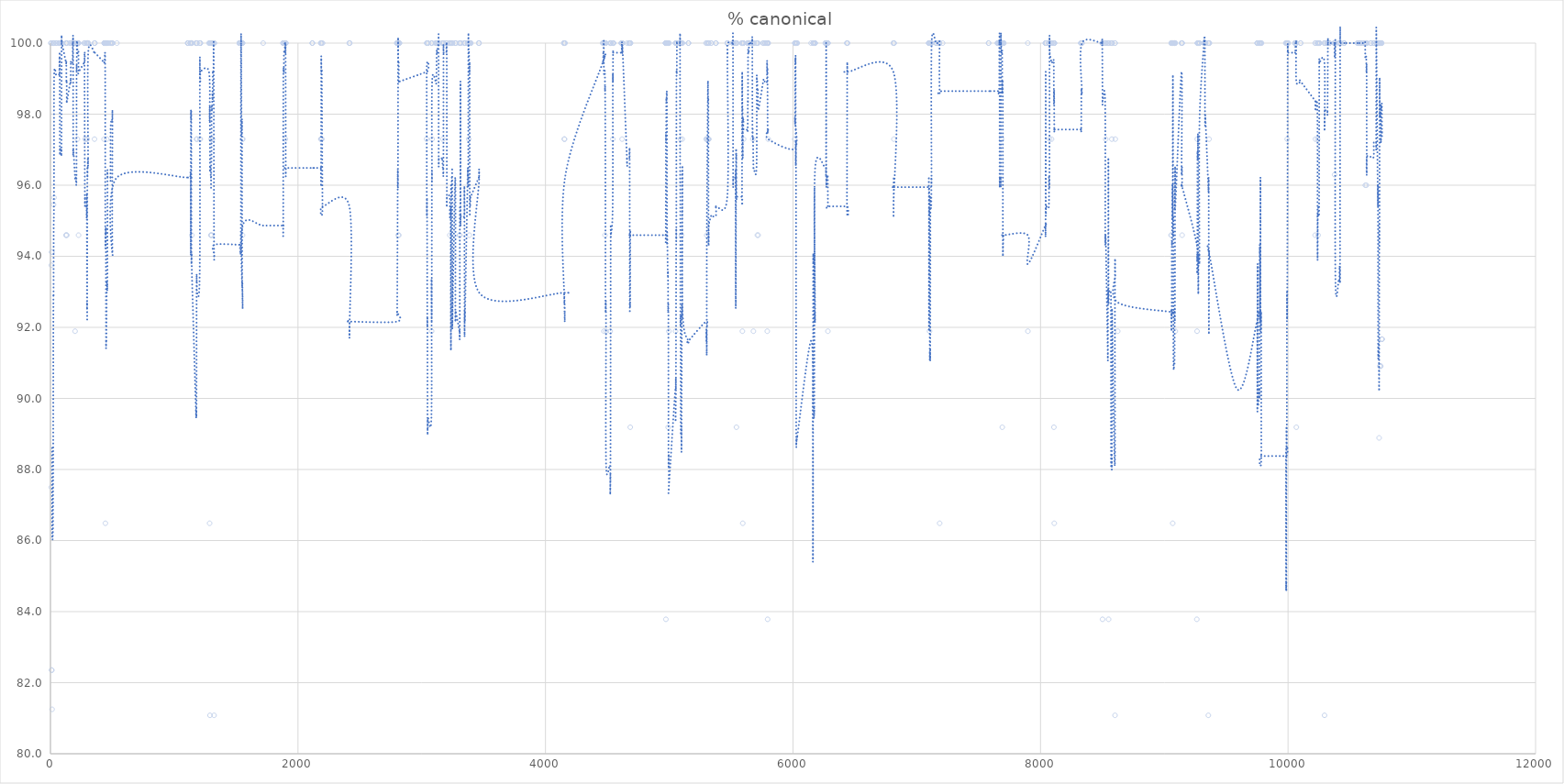
| Category | % canonical |
|---|---|
| 4.0 | 100 |
| 5.0 | 100 |
| 6.0 | 87.5 |
| 7.0 | 93.75 |
| 8.0 | 70.588 |
| 9.0 | 82.353 |
| 10.0 | 94.118 |
| 11.0 | 82.353 |
| 12.0 | 94.118 |
| 13.0 | 81.25 |
| 14.0 | 76.471 |
| 20.0 | 100 |
| 21.0 | 100 |
| 22.0 | 100 |
| 23.0 | 100 |
| 24.0 | 100 |
| 25.0 | 95.455 |
| 26.0 | 100 |
| 28.0 | 100 |
| 29.0 | 95.652 |
| 30.0 | 100 |
| 45.0 | 100 |
| 46.0 | 100 |
| 47.0 | 100 |
| 71.0 | 100 |
| 72.0 | 100 |
| 73.0 | 100 |
| 74.0 | 100 |
| 75.0 | 100 |
| 76.0 | 70.37 |
| 78.0 | 100 |
| 79.0 | 100 |
| 81.0 | 100 |
| 82.0 | 100 |
| 83.0 | 100 |
| 86.0 | 100 |
| 87.0 | 100 |
| 88.0 | 100 |
| 89.0 | 100 |
| 90.0 | 100 |
| 91.0 | 100 |
| 92.0 | 100 |
| 93.0 | 100 |
| 125.0 | 94.595 |
| 126.0 | 100 |
| 127.0 | 100 |
| 128.0 | 100 |
| 129.0 | 94.595 |
| 130.0 | 100 |
| 131.0 | 100 |
| 132.0 | 94.595 |
| 133.0 | 100 |
| 134.0 | 100 |
| 161.0 | 100 |
| 162.0 | 100 |
| 163.0 | 100 |
| 164.0 | 100 |
| 165.0 | 100 |
| 166.0 | 100 |
| 179.0 | 100 |
| 180.0 | 100 |
| 181.0 | 100 |
| 182.0 | 100 |
| 183.0 | 100 |
| 184.0 | 70.27 |
| 185.0 | 100 |
| 199.0 | 91.892 |
| 200.0 | 100 |
| 202.0 | 100 |
| 203.0 | 100 |
| 204.0 | 100 |
| 205.0 | 100 |
| 206.0 | 100 |
| 210.0 | 100 |
| 211.0 | 100 |
| 212.0 | 100 |
| 213.0 | 100 |
| 214.0 | 100 |
| 215.0 | 100 |
| 216.0 | 100 |
| 217.0 | 100 |
| 218.0 | 97.297 |
| 219.0 | 100 |
| 220.0 | 100 |
| 221.0 | 100 |
| 223.0 | 100 |
| 224.0 | 100 |
| 225.0 | 100 |
| 226.0 | 100 |
| 227.0 | 94.595 |
| 228.0 | 100 |
| 274.0 | 100 |
| 275.0 | 100 |
| 278.0 | 62.162 |
| 279.0 | 100 |
| 280.0 | 97.297 |
| 291.0 | 100 |
| 292.0 | 97.297 |
| 293.0 | 100 |
| 294.0 | 100 |
| 295.0 | 70.27 |
| 296.0 | 100 |
| 297.0 | 97.297 |
| 298.0 | 100 |
| 299.0 | 100 |
| 300.0 | 100 |
| 301.0 | 100 |
| 302.0 | 100 |
| 303.0 | 100 |
| 304.0 | 100 |
| 305.0 | 100 |
| 355.0 | 100 |
| 356.0 | 97.297 |
| 358.0 | 100 |
| 359.0 | 100 |
| 433.0 | 97.297 |
| 434.0 | 100 |
| 435.0 | 100 |
| 436.0 | 100 |
| 437.0 | 100 |
| 438.0 | 100 |
| 442.0 | 100 |
| 443.0 | 59.459 |
| 444.0 | 86.486 |
| 445.0 | 100 |
| 446.0 | 100 |
| 447.0 | 100 |
| 448.0 | 100 |
| 449.0 | 70.27 |
| 450.0 | 100 |
| 451.0 | 100 |
| 452.0 | 100 |
| 453.0 | 64.865 |
| 455.0 | 97.297 |
| 456.0 | 100 |
| 457.0 | 100 |
| 458.0 | 100 |
| 460.0 | 100 |
| 461.0 | 100 |
| 462.0 | 100 |
| 484.0 | 100 |
| 485.0 | 100 |
| 486.0 | 78.378 |
| 494.0 | 100 |
| 495.0 | 100 |
| 496.0 | 100 |
| 497.0 | 100 |
| 498.0 | 100 |
| 499.0 | 100 |
| 500.0 | 100 |
| 501.0 | 100 |
| 502.0 | 62.162 |
| 537.0 | 100 |
| 1109.0 | 100 |
| 1110.0 | 100 |
| 1111.0 | 100 |
| 1112.0 | 100 |
| 1129.0 | 100 |
| 1130.0 | 100 |
| 1133.0 | 100 |
| 1134.0 | 78.378 |
| 1135.0 | 100 |
| 1136.0 | 100 |
| 1137.0 | 100 |
| 1138.0 | 100 |
| 1139.0 | 62.162 |
| 1140.0 | 100 |
| 1141.0 | 100 |
| 1142.0 | 100 |
| 1143.0 | 94.595 |
| 1175.0 | 40.541 |
| 1176.0 | 100 |
| 1178.0 | 100 |
| 1179.0 | 100 |
| 1180.0 | 100 |
| 1181.0 | 97.297 |
| 1182.0 | 100 |
| 1183.0 | 100 |
| 1184.0 | 97.297 |
| 1206.0 | 100 |
| 1207.0 | 97.297 |
| 1208.0 | 100 |
| 1209.0 | 100 |
| 1210.0 | 100 |
| 1211.0 | 97.297 |
| 1212.0 | 100 |
| 1281.0 | 100 |
| 1286.0 | 86.486 |
| 1287.0 | 100 |
| 1288.0 | 100 |
| 1289.0 | 81.081 |
| 1290.0 | 100 |
| 1291.0 | 100 |
| 1292.0 | 100 |
| 1296.0 | 94.595 |
| 1297.0 | 100 |
| 1298.0 | 97.297 |
| 1299.0 | 94.595 |
| 1300.0 | 100 |
| 1301.0 | 100 |
| 1302.0 | 94.595 |
| 1303.0 | 100 |
| 1304.0 | 100 |
| 1305.0 | 100 |
| 1309.0 | 100 |
| 1310.0 | 97.297 |
| 1311.0 | 100 |
| 1312.0 | 100 |
| 1313.0 | 100 |
| 1317.0 | 100 |
| 1318.0 | 100 |
| 1319.0 | 100 |
| 1321.0 | 62.162 |
| 1322.0 | 81.081 |
| 1324.0 | 100 |
| 1325.0 | 100 |
| 1526.0 | 100 |
| 1527.0 | 100 |
| 1528.0 | 100 |
| 1529.0 | 100 |
| 1530.0 | 100 |
| 1538.0 | 100 |
| 1539.0 | 100 |
| 1540.0 | 100 |
| 1541.0 | 100 |
| 1544.0 | 75.676 |
| 1545.0 | 100 |
| 1546.0 | 100 |
| 1547.0 | 100 |
| 1548.0 | 100 |
| 1549.0 | 59.459 |
| 1550.0 | 97.297 |
| 1551.0 | 100 |
| 1552.0 | 94.595 |
| 1553.0 | 100 |
| 1554.0 | 97.297 |
| 1719.0 | 100 |
| 1879.0 | 100 |
| 1880.0 | 100 |
| 1881.0 | 100 |
| 1882.0 | 100 |
| 1885.0 | 100 |
| 1886.0 | 100 |
| 1887.0 | 100 |
| 1893.0 | 100 |
| 1894.0 | 100 |
| 1895.0 | 100 |
| 1896.0 | 100 |
| 1897.0 | 100 |
| 1898.0 | 97.297 |
| 1899.0 | 100 |
| 1900.0 | 100 |
| 1901.0 | 67.568 |
| 1902.0 | 100 |
| 1903.0 | 100 |
| 2115.0 | 100 |
| 2116.0 | 100 |
| 2117.0 | 100 |
| 2184.0 | 100 |
| 2185.0 | 97.297 |
| 2186.0 | 97.297 |
| 2187.0 | 100 |
| 2188.0 | 100 |
| 2189.0 | 97.297 |
| 2192.0 | 100 |
| 2193.0 | 97.297 |
| 2198.0 | 64.865 |
| 2199.0 | 100 |
| 2415.0 | 100 |
| 2416.0 | 62.162 |
| 2417.0 | 100 |
| 2418.0 | 100 |
| 2799.0 | 100 |
| 2800.0 | 100 |
| 2801.0 | 100 |
| 2802.0 | 100 |
| 2806.0 | 100 |
| 2807.0 | 100 |
| 2808.0 | 100 |
| 2809.0 | 100 |
| 2810.0 | 94.595 |
| 2811.0 | 100 |
| 2812.0 | 100 |
| 2813.0 | 100 |
| 2814.0 | 100 |
| 2815.0 | 94.595 |
| 2816.0 | 100 |
| 2817.0 | 100 |
| 2818.0 | 100 |
| 2821.0 | 100 |
| 3039.0 | 97.297 |
| 3040.0 | 100 |
| 3041.0 | 62.162 |
| 3042.0 | 100 |
| 3043.0 | 100 |
| 3045.0 | 62.162 |
| 3046.0 | 100 |
| 3047.0 | 70.27 |
| 3048.0 | 100 |
| 3049.0 | 100 |
| 3050.0 | 100 |
| 3078.0 | 100 |
| 3079.0 | 100 |
| 3080.0 | 91.892 |
| 3081.0 | 100 |
| 3082.0 | 100 |
| 3083.0 | 100 |
| 3084.0 | 97.297 |
| 3113.0 | 100 |
| 3114.0 | 100 |
| 3115.0 | 100 |
| 3116.0 | 100 |
| 3118.0 | 100 |
| 3121.0 | 100 |
| 3122.0 | 100 |
| 3123.0 | 100 |
| 3124.0 | 100 |
| 3135.0 | 100 |
| 3136.0 | 100 |
| 3137.0 | 67.568 |
| 3138.0 | 100 |
| 3139.0 | 100 |
| 3165.0 | 100 |
| 3166.0 | 100 |
| 3170.0 | 97.297 |
| 3171.0 | 100 |
| 3172.0 | 100 |
| 3173.0 | 100 |
| 3175.0 | 100 |
| 3176.0 | 100 |
| 3177.0 | 100 |
| 3198.0 | 100 |
| 3199.0 | 100 |
| 3202.0 | 100 |
| 3203.0 | 56.757 |
| 3204.0 | 100 |
| 3226.0 | 100 |
| 3227.0 | 94.595 |
| 3229.0 | 100 |
| 3230.0 | 100 |
| 3232.0 | 100 |
| 3233.0 | 100 |
| 3234.0 | 100 |
| 3236.0 | 62.162 |
| 3237.0 | 100 |
| 3238.0 | 100 |
| 3239.0 | 100 |
| 3243.0 | 100 |
| 3244.0 | 100 |
| 3245.0 | 100 |
| 3246.0 | 100 |
| 3248.0 | 62.162 |
| 3249.0 | 100 |
| 3271.0 | 100 |
| 3272.0 | 62.162 |
| 3274.0 | 100 |
| 3275.0 | 100 |
| 3276.0 | 100 |
| 3305.0 | 94.595 |
| 3306.0 | 100 |
| 3307.0 | 100 |
| 3308.0 | 94.595 |
| 3309.0 | 100 |
| 3312.0 | 100 |
| 3313.0 | 100 |
| 3314.0 | 62.162 |
| 3315.0 | 100 |
| 3343.0 | 100 |
| 3344.0 | 100 |
| 3345.0 | 100 |
| 3346.0 | 62.162 |
| 3347.0 | 100 |
| 3348.0 | 100 |
| 3349.0 | 100 |
| 3350.0 | 100 |
| 3371.0 | 100 |
| 3372.0 | 100 |
| 3374.0 | 100 |
| 3375.0 | 100 |
| 3376.0 | 100 |
| 3377.0 | 100 |
| 3378.0 | 100 |
| 3380.0 | 97.297 |
| 3381.0 | 100 |
| 3382.0 | 100 |
| 3385.0 | 94.595 |
| 3386.0 | 100 |
| 3387.0 | 100 |
| 3388.0 | 62.162 |
| 3389.0 | 100 |
| 3391.0 | 100 |
| 3392.0 | 100 |
| 3394.0 | 100 |
| 3395.0 | 100 |
| 3396.0 | 100 |
| 3461.0 | 100 |
| 3462.0 | 100 |
| 3463.0 | 100 |
| 3464.0 | 62.162 |
| 3465.0 | 67.568 |
| 4148.0 | 100 |
| 4149.0 | 100 |
| 4150.0 | 100 |
| 4152.0 | 97.297 |
| 4153.0 | 100 |
| 4154.0 | 97.297 |
| 4155.0 | 100 |
| 4156.0 | 100 |
| 4158.0 | 100 |
| 4463.0 | 100 |
| 4464.0 | 100 |
| 4465.0 | 100 |
| 4466.0 | 100 |
| 4467.0 | 100 |
| 4469.0 | 100 |
| 4470.0 | 100 |
| 4471.0 | 100 |
| 4472.0 | 91.892 |
| 4473.0 | 100 |
| 4474.0 | 100 |
| 4475.0 | 100 |
| 4476.0 | 100 |
| 4477.0 | 100 |
| 4478.0 | 100 |
| 4480.0 | 100 |
| 4481.0 | 94.595 |
| 4482.0 | 100 |
| 4484.0 | 72.973 |
| 4485.0 | 59.459 |
| 4487.0 | 100 |
| 4488.0 | 100 |
| 4489.0 | 91.892 |
| 4490.0 | 62.162 |
| 4522.0 | 100 |
| 4523.0 | 91.892 |
| 4524.0 | 100 |
| 4525.0 | 100 |
| 4526.0 | 100 |
| 4527.0 | 100 |
| 4528.0 | 100 |
| 4529.0 | 100 |
| 4543.0 | 100 |
| 4544.0 | 97.297 |
| 4545.0 | 100 |
| 4546.0 | 100 |
| 4547.0 | 100 |
| 4549.0 | 100 |
| 4550.0 | 100 |
| 4612.0 | 100 |
| 4613.0 | 100 |
| 4615.0 | 100 |
| 4616.0 | 100 |
| 4617.0 | 100 |
| 4618.0 | 100 |
| 4619.0 | 97.297 |
| 4621.0 | 100 |
| 4624.0 | 100 |
| 4658.0 | 70.27 |
| 4659.0 | 100 |
| 4674.0 | 100 |
| 4676.0 | 100 |
| 4677.0 | 100 |
| 4678.0 | 100 |
| 4680.0 | 100 |
| 4681.0 | 56.757 |
| 4682.0 | 100 |
| 4684.0 | 100 |
| 4685.0 | 89.189 |
| 4686.0 | 100 |
| 4687.0 | 100 |
| 4969.0 | 100 |
| 4970.0 | 100 |
| 4971.0 | 100 |
| 4972.0 | 100 |
| 4973.0 | 83.784 |
| 4974.0 | 100 |
| 4975.0 | 100 |
| 4976.0 | 100 |
| 4977.0 | 100 |
| 4978.0 | 100 |
| 4981.0 | 100 |
| 4982.0 | 62.162 |
| 4983.0 | 100 |
| 4984.0 | 100 |
| 4988.0 | 72.973 |
| 4989.0 | 100 |
| 4990.0 | 100 |
| 4991.0 | 89.189 |
| 4993.0 | 100 |
| 4994.0 | 59.459 |
| 4995.0 | 100 |
| 4996.0 | 62.162 |
| 4997.0 | 91.892 |
| 4998.0 | 100 |
| 5050.0 | 100 |
| 5051.0 | 91.892 |
| 5052.0 | 100 |
| 5053.0 | 100 |
| 5054.0 | 100 |
| 5056.0 | 100 |
| 5057.0 | 100 |
| 5058.0 | 100 |
| 5059.0 | 100 |
| 5060.0 | 100 |
| 5061.0 | 100 |
| 5062.0 | 100 |
| 5063.0 | 100 |
| 5086.0 | 100 |
| 5087.0 | 100 |
| 5088.0 | 62.162 |
| 5089.0 | 100 |
| 5090.0 | 62.162 |
| 5091.0 | 97.297 |
| 5092.0 | 100 |
| 5093.0 | 70.27 |
| 5094.0 | 100 |
| 5096.0 | 100 |
| 5098.0 | 100 |
| 5099.0 | 94.595 |
| 5102.0 | 100 |
| 5104.0 | 100 |
| 5105.0 | 97.297 |
| 5107.0 | 100 |
| 5108.0 | 62.162 |
| 5152.0 | 62.162 |
| 5154.0 | 100 |
| 5155.0 | 100 |
| 5156.0 | 100 |
| 5298.0 | 100 |
| 5299.0 | 97.297 |
| 5300.0 | 97.297 |
| 5302.0 | 100 |
| 5303.0 | 94.595 |
| 5304.0 | 97.297 |
| 5312.0 | 100 |
| 5313.0 | 100 |
| 5314.0 | 97.297 |
| 5315.0 | 100 |
| 5316.0 | 97.297 |
| 5317.0 | 62.162 |
| 5318.0 | 97.297 |
| 5319.0 | 97.297 |
| 5320.0 | 100 |
| 5338.0 | 100 |
| 5339.0 | 100 |
| 5376.0 | 100 |
| 5377.0 | 100 |
| 5378.0 | 100 |
| 5469.0 | 100 |
| 5470.0 | 100 |
| 5471.0 | 100 |
| 5472.0 | 100 |
| 5513.0 | 100 |
| 5514.0 | 100 |
| 5515.0 | 100 |
| 5516.0 | 62.162 |
| 5517.0 | 100 |
| 5518.0 | 100 |
| 5519.0 | 100 |
| 5520.0 | 100 |
| 5521.0 | 100 |
| 5535.0 | 100 |
| 5536.0 | 100 |
| 5537.0 | 67.568 |
| 5538.0 | 100 |
| 5540.0 | 100 |
| 5541.0 | 100 |
| 5542.0 | 100 |
| 5543.0 | 89.189 |
| 5544.0 | 100 |
| 5545.0 | 100 |
| 5587.0 | 100 |
| 5588.0 | 100 |
| 5589.0 | 100 |
| 5590.0 | 100 |
| 5591.0 | 91.892 |
| 5592.0 | 100 |
| 5594.0 | 86.486 |
| 5595.0 | 100 |
| 5598.0 | 100 |
| 5599.0 | 100 |
| 5600.0 | 100 |
| 5601.0 | 97.297 |
| 5633.0 | 100 |
| 5634.0 | 100 |
| 5635.0 | 100 |
| 5636.0 | 100 |
| 5637.0 | 100 |
| 5640.0 | 100 |
| 5641.0 | 100 |
| 5642.0 | 100 |
| 5643.0 | 100 |
| 5644.0 | 100 |
| 5645.0 | 100 |
| 5646.0 | 100 |
| 5647.0 | 100 |
| 5669.0 | 100 |
| 5670.0 | 100 |
| 5671.0 | 100 |
| 5672.0 | 75.676 |
| 5673.0 | 100 |
| 5674.0 | 100 |
| 5675.0 | 97.297 |
| 5676.0 | 100 |
| 5677.0 | 100 |
| 5680.0 | 91.892 |
| 5681.0 | 100 |
| 5682.0 | 100 |
| 5705.0 | 100 |
| 5707.0 | 100 |
| 5708.0 | 100 |
| 5711.0 | 100 |
| 5712.0 | 94.595 |
| 5717.0 | 100 |
| 5718.0 | 94.595 |
| 5759.0 | 100 |
| 5760.0 | 100 |
| 5761.0 | 100 |
| 5774.0 | 100 |
| 5775.0 | 100 |
| 5776.0 | 100 |
| 5789.0 | 100 |
| 5790.0 | 100 |
| 5791.0 | 100 |
| 5792.0 | 91.892 |
| 5793.0 | 100 |
| 5794.0 | 100 |
| 5795.0 | 83.784 |
| 5796.0 | 100 |
| 5797.0 | 100 |
| 5798.0 | 100 |
| 5799.0 | 100 |
| 5800.0 | 97.297 |
| 6014.0 | 97.297 |
| 6015.0 | 100 |
| 6016.0 | 100 |
| 6017.0 | 100 |
| 6018.0 | 100 |
| 6020.0 | 100 |
| 6021.0 | 100 |
| 6022.0 | 72.973 |
| 6023.0 | 100 |
| 6024.0 | 100 |
| 6025.0 | 56.757 |
| 6026.0 | 59.459 |
| 6028.0 | 100 |
| 6029.0 | 100 |
| 6030.0 | 100 |
| 6033.0 | 100 |
| 6034.0 | 100 |
| 6146.0 | 100 |
| 6160.0 | 75.676 |
| 6161.0 | 62.162 |
| 6162.0 | 100 |
| 6163.0 | 100 |
| 6164.0 | 100 |
| 6165.0 | 100 |
| 6169.0 | 59.459 |
| 6170.0 | 100 |
| 6171.0 | 100 |
| 6172.0 | 100 |
| 6173.0 | 100 |
| 6174.0 | 100 |
| 6175.0 | 64.865 |
| 6176.0 | 100 |
| 6177.0 | 100 |
| 6178.0 | 100 |
| 6179.0 | 100 |
| 6261.0 | 100 |
| 6264.0 | 100 |
| 6265.0 | 100 |
| 6266.0 | 100 |
| 6267.0 | 100 |
| 6268.0 | 100 |
| 6269.0 | 62.162 |
| 6270.0 | 100 |
| 6271.0 | 100 |
| 6279.0 | 100 |
| 6280.0 | 100 |
| 6281.0 | 100 |
| 6282.0 | 91.892 |
| 6283.0 | 100 |
| 6435.0 | 100 |
| 6436.0 | 100 |
| 6438.0 | 100 |
| 6439.0 | 100 |
| 6440.0 | 100 |
| 6811.0 | 100 |
| 6812.0 | 62.162 |
| 6813.0 | 100 |
| 6814.0 | 100 |
| 6815.0 | 97.297 |
| 6816.0 | 100 |
| 6817.0 | 100 |
| 7096.0 | 100 |
| 7097.0 | 100 |
| 7098.0 | 100 |
| 7099.0 | 59.459 |
| 7100.0 | 100 |
| 7101.0 | 100 |
| 7102.0 | 100 |
| 7103.0 | 91.892 |
| 7104.0 | 100 |
| 7105.0 | 62.162 |
| 7106.0 | 100 |
| 7108.0 | 100 |
| 7109.0 | 100 |
| 7110.0 | 100 |
| 7111.0 | 100 |
| 7112.0 | 100 |
| 7117.0 | 100 |
| 7118.0 | 100 |
| 7119.0 | 100 |
| 7120.0 | 100 |
| 7155.0 | 100 |
| 7156.0 | 100 |
| 7157.0 | 100 |
| 7158.0 | 100 |
| 7176.0 | 100 |
| 7177.0 | 100 |
| 7178.0 | 100 |
| 7179.0 | 100 |
| 7180.0 | 100 |
| 7181.0 | 100 |
| 7182.0 | 100 |
| 7183.0 | 100 |
| 7184.0 | 100 |
| 7185.0 | 86.486 |
| 7209.0 | 100 |
| 7580.0 | 100 |
| 7581.0 | 100 |
| 7651.0 | 100 |
| 7652.0 | 100 |
| 7656.0 | 100 |
| 7657.0 | 100 |
| 7658.0 | 100 |
| 7666.0 | 100 |
| 7667.0 | 100 |
| 7668.0 | 100 |
| 7669.0 | 100 |
| 7670.0 | 62.162 |
| 7671.0 | 100 |
| 7672.0 | 100 |
| 7673.0 | 100 |
| 7674.0 | 100 |
| 7675.0 | 100 |
| 7676.0 | 100 |
| 7677.0 | 100 |
| 7678.0 | 100 |
| 7679.0 | 100 |
| 7680.0 | 100 |
| 7681.0 | 100 |
| 7685.0 | 97.297 |
| 7686.0 | 100 |
| 7687.0 | 100 |
| 7689.0 | 100 |
| 7690.0 | 100 |
| 7691.0 | 89.189 |
| 7692.0 | 100 |
| 7695.0 | 100 |
| 7696.0 | 56.757 |
| 7697.0 | 100 |
| 7701.0 | 100 |
| 7702.0 | 100 |
| 7703.0 | 100 |
| 7897.0 | 100 |
| 7898.0 | 91.892 |
| 8039.0 | 100 |
| 8040.0 | 100 |
| 8041.0 | 100 |
| 8042.0 | 100 |
| 8043.0 | 62.162 |
| 8044.0 | 100 |
| 8045.0 | 100 |
| 8046.0 | 100 |
| 8067.0 | 100 |
| 8068.0 | 100 |
| 8069.0 | 100 |
| 8070.0 | 100 |
| 8071.0 | 100 |
| 8072.0 | 100 |
| 8073.0 | 100 |
| 8074.0 | 97.297 |
| 8089.0 | 97.297 |
| 8090.0 | 100 |
| 8091.0 | 100 |
| 8092.0 | 100 |
| 8104.0 | 100 |
| 8105.0 | 100 |
| 8107.0 | 100 |
| 8108.0 | 89.189 |
| 8109.0 | 100 |
| 8110.0 | 100 |
| 8111.0 | 86.486 |
| 8112.0 | 100 |
| 8113.0 | 100 |
| 8325.0 | 100 |
| 8327.0 | 100 |
| 8328.0 | 100 |
| 8329.0 | 100 |
| 8330.0 | 100 |
| 8332.0 | 100 |
| 8334.0 | 100 |
| 8335.0 | 100 |
| 8497.0 | 100 |
| 8498.0 | 100 |
| 8499.0 | 100 |
| 8501.0 | 83.784 |
| 8502.0 | 100 |
| 8522.0 | 100 |
| 8523.0 | 62.162 |
| 8524.0 | 100 |
| 8525.0 | 100 |
| 8527.0 | 97.297 |
| 8528.0 | 100 |
| 8543.0 | 70.27 |
| 8544.0 | 100 |
| 8545.0 | 100 |
| 8546.0 | 100 |
| 8547.0 | 100 |
| 8548.0 | 100 |
| 8549.0 | 75.676 |
| 8550.0 | 83.784 |
| 8551.0 | 100 |
| 8568.0 | 100 |
| 8569.0 | 62.162 |
| 8570.0 | 62.162 |
| 8571.0 | 100 |
| 8572.0 | 100 |
| 8575.0 | 100 |
| 8576.0 | 97.297 |
| 8577.0 | 100 |
| 8578.0 | 100 |
| 8579.0 | 100 |
| 8600.0 | 59.459 |
| 8601.0 | 100 |
| 8602.0 | 81.081 |
| 8603.0 | 100 |
| 8604.0 | 97.297 |
| 8624.0 | 91.892 |
| 9055.0 | 94.595 |
| 9056.0 | 100 |
| 9057.0 | 100 |
| 9058.0 | 94.595 |
| 9059.0 | 64.865 |
| 9060.0 | 100 |
| 9061.0 | 100 |
| 9062.0 | 100 |
| 9063.0 | 100 |
| 9064.0 | 100 |
| 9065.0 | 100 |
| 9066.0 | 100 |
| 9067.0 | 100 |
| 9068.0 | 86.486 |
| 9069.0 | 100 |
| 9070.0 | 100 |
| 9071.0 | 62.162 |
| 9072.0 | 100 |
| 9073.0 | 100 |
| 9074.0 | 62.162 |
| 9081.0 | 100 |
| 9082.0 | 100 |
| 9083.0 | 100 |
| 9084.0 | 100 |
| 9085.0 | 100 |
| 9086.0 | 100 |
| 9087.0 | 100 |
| 9088.0 | 100 |
| 9089.0 | 91.892 |
| 9139.0 | 100 |
| 9140.0 | 72.973 |
| 9141.0 | 100 |
| 9142.0 | 100 |
| 9143.0 | 100 |
| 9144.0 | 94.595 |
| 9145.0 | 100 |
| 9263.0 | 83.784 |
| 9265.0 | 91.892 |
| 9266.0 | 97.297 |
| 9267.0 | 100 |
| 9268.0 | 100 |
| 9269.0 | 100 |
| 9270.0 | 100 |
| 9271.0 | 100 |
| 9272.0 | 100 |
| 9274.0 | 62.162 |
| 9275.0 | 78.378 |
| 9276.0 | 100 |
| 9277.0 | 100 |
| 9278.0 | 100 |
| 9279.0 | 100 |
| 9280.0 | 100 |
| 9282.0 | 100 |
| 9283.0 | 100 |
| 9284.0 | 100 |
| 9285.0 | 100 |
| 9321.0 | 100 |
| 9322.0 | 100 |
| 9323.0 | 100 |
| 9324.0 | 100 |
| 9325.0 | 100 |
| 9328.0 | 100 |
| 9329.0 | 78.378 |
| 9331.0 | 100 |
| 9332.0 | 100 |
| 9333.0 | 100 |
| 9356.0 | 81.081 |
| 9357.0 | 100 |
| 9358.0 | 100 |
| 9359.0 | 100 |
| 9360.0 | 62.162 |
| 9361.0 | 100 |
| 9362.0 | 97.297 |
| 9363.0 | 100 |
| 9364.0 | 100 |
| 9586.0 | 62.162 |
| 9750.0 | 100 |
| 9751.0 | 100 |
| 9752.0 | 78.378 |
| 9753.0 | 100 |
| 9754.0 | 100 |
| 9755.0 | 62.162 |
| 9767.0 | 100 |
| 9768.0 | 100 |
| 9769.0 | 100 |
| 9771.0 | 100 |
| 9772.0 | 100 |
| 9773.0 | 100 |
| 9774.0 | 62.162 |
| 9775.0 | 100 |
| 9776.0 | 100 |
| 9777.0 | 100 |
| 9778.0 | 59.459 |
| 9782.0 | 100 |
| 9783.0 | 100 |
| 9784.0 | 62.162 |
| 9785.0 | 100 |
| 9982.0 | 100 |
| 9983.0 | 62.162 |
| 9984.0 | 64.865 |
| 9985.0 | 100 |
| 9986.0 | 100 |
| 9987.0 | 100 |
| 9988.0 | 100 |
| 9990.0 | 100 |
| 9991.0 | 100 |
| 9992.0 | 100 |
| 9993.0 | 97.297 |
| 9996.0 | 100 |
| 9997.0 | 100 |
| 9998.0 | 100 |
| 9999.0 | 100 |
| 10000.0 | 100 |
| 10056.0 | 100 |
| 10057.0 | 100 |
| 10058.0 | 100 |
| 10059.0 | 100 |
| 10060.0 | 100 |
| 10061.0 | 100 |
| 10063.0 | 100 |
| 10064.0 | 100 |
| 10065.0 | 100 |
| 10066.0 | 100 |
| 10067.0 | 89.189 |
| 10101.0 | 100 |
| 10102.0 | 100 |
| 10219.0 | 94.595 |
| 10220.0 | 100 |
| 10221.0 | 97.297 |
| 10222.0 | 100 |
| 10237.0 | 100 |
| 10238.0 | 62.162 |
| 10239.0 | 97.297 |
| 10240.0 | 100 |
| 10241.0 | 100 |
| 10242.0 | 100 |
| 10243.0 | 94.595 |
| 10244.0 | 100 |
| 10245.0 | 100 |
| 10250.0 | 100 |
| 10251.0 | 100 |
| 10252.0 | 100 |
| 10253.0 | 100 |
| 10254.0 | 100 |
| 10294.0 | 100 |
| 10295.0 | 81.081 |
| 10296.0 | 100 |
| 10297.0 | 100 |
| 10298.0 | 100 |
| 10299.0 | 100 |
| 10315.0 | 100 |
| 10316.0 | 100 |
| 10317.0 | 100 |
| 10318.0 | 100 |
| 10319.0 | 100 |
| 10322.0 | 100 |
| 10323.0 | 100 |
| 10324.0 | 100 |
| 10326.0 | 100 |
| 10327.0 | 100 |
| 10328.0 | 100 |
| 10329.0 | 100 |
| 10330.0 | 100 |
| 10331.0 | 100 |
| 10332.0 | 100 |
| 10333.0 | 100 |
| 10334.0 | 100 |
| 10335.0 | 100 |
| 10336.0 | 100 |
| 10371.0 | 100 |
| 10374.0 | 100 |
| 10375.0 | 100 |
| 10376.0 | 96.296 |
| 10379.0 | 100 |
| 10380.0 | 100 |
| 10381.0 | 100 |
| 10382.0 | 100 |
| 10383.0 | 37.037 |
| 10410.0 | 100 |
| 10413.0 | 100 |
| 10414.0 | 100 |
| 10415.0 | 100 |
| 10416.0 | 100 |
| 10417.0 | 100 |
| 10418.0 | 100 |
| 10419.0 | 100 |
| 10420.0 | 100 |
| 10421.0 | 100 |
| 10422.0 | 100 |
| 10423.0 | 100 |
| 10451.0 | 100 |
| 10452.0 | 100 |
| 10453.0 | 100 |
| 10454.0 | 100 |
| 10455.0 | 100 |
| 10562.0 | 100 |
| 10563.0 | 100 |
| 10564.0 | 100 |
| 10565.0 | 100 |
| 10566.0 | 100 |
| 10576.0 | 100 |
| 10577.0 | 100 |
| 10578.0 | 100 |
| 10580.0 | 100 |
| 10581.0 | 100 |
| 10582.0 | 100 |
| 10583.0 | 100 |
| 10588.0 | 100 |
| 10589.0 | 100 |
| 10590.0 | 100 |
| 10591.0 | 100 |
| 10592.0 | 100 |
| 10593.0 | 100 |
| 10618.0 | 100 |
| 10619.0 | 100 |
| 10620.0 | 100 |
| 10621.0 | 100 |
| 10622.0 | 100 |
| 10623.0 | 100 |
| 10624.0 | 96 |
| 10625.0 | 100 |
| 10629.0 | 100 |
| 10630.0 | 100 |
| 10631.0 | 100 |
| 10632.0 | 100 |
| 10633.0 | 96 |
| 10634.0 | 100 |
| 10635.0 | 100 |
| 10636.0 | 72 |
| 10637.0 | 100 |
| 10667.0 | 100 |
| 10668.0 | 100 |
| 10669.0 | 100 |
| 10670.0 | 100 |
| 10692.0 | 100 |
| 10693.0 | 100 |
| 10711.0 | 100 |
| 10712.0 | 100 |
| 10713.0 | 100 |
| 10714.0 | 100 |
| 10725.0 | 57.143 |
| 10726.0 | 100 |
| 10727.0 | 100 |
| 10728.0 | 57.143 |
| 10730.0 | 100 |
| 10731.0 | 100 |
| 10732.0 | 100 |
| 10733.0 | 100 |
| 10734.0 | 100 |
| 10736.0 | 88.889 |
| 10737.0 | 100 |
| 10738.0 | 100 |
| 10739.0 | 100 |
| 10740.0 | 100 |
| 10741.0 | 90.909 |
| 10743.0 | 100 |
| 10744.0 | 100 |
| 10745.0 | 100 |
| 10746.0 | 100 |
| 10747.0 | 90.909 |
| 10748.0 | 100 |
| 10749.0 | 90.909 |
| 10750.0 | 100 |
| 10751.0 | 100 |
| 10752.0 | 100 |
| 10753.0 | 100 |
| 10754.0 | 100 |
| 10755.0 | 100 |
| 10756.0 | 100 |
| 10758.0 | 91.667 |
| 10759.0 | 91.667 |
| 10760.0 | 91.667 |